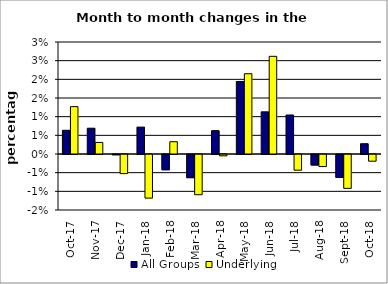
| Category | All Groups | Underlying |
|---|---|---|
| 2017-10-01 | 0.006 | 0.013 |
| 2017-11-01 | 0.007 | 0.003 |
| 2017-12-01 | 0 | -0.005 |
| 2018-01-01 | 0.007 | -0.012 |
| 2018-02-01 | -0.004 | 0.003 |
| 2018-03-01 | -0.006 | -0.011 |
| 2018-04-01 | 0.006 | 0 |
| 2018-05-01 | 0.019 | 0.021 |
| 2018-06-01 | 0.011 | 0.026 |
| 2018-07-01 | 0.01 | -0.004 |
| 2018-08-01 | -0.003 | -0.003 |
| 2018-09-01 | -0.006 | -0.009 |
| 2018-10-01 | 0.003 | -0.002 |